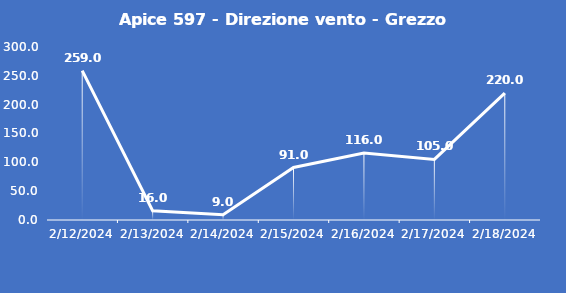
| Category | Apice 597 - Direzione vento - Grezzo (°N) |
|---|---|
| 2/12/24 | 259 |
| 2/13/24 | 16 |
| 2/14/24 | 9 |
| 2/15/24 | 91 |
| 2/16/24 | 116 |
| 2/17/24 | 105 |
| 2/18/24 | 220 |